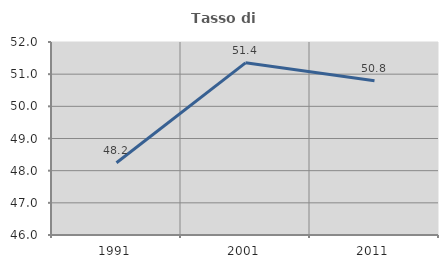
| Category | Tasso di occupazione   |
|---|---|
| 1991.0 | 48.247 |
| 2001.0 | 51.352 |
| 2011.0 | 50.799 |